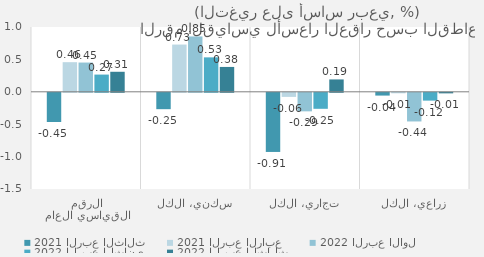
| Category | 2021 | 2022 |
|---|---|---|
| الرقم القياسي العام | 0.457 | 0.309 |
| سكني، الكل | 0.729 | 0.384 |
| تجاري، الكل | -0.063 | 0.191 |
| زراعي، الكل | -0.008 | -0.009 |